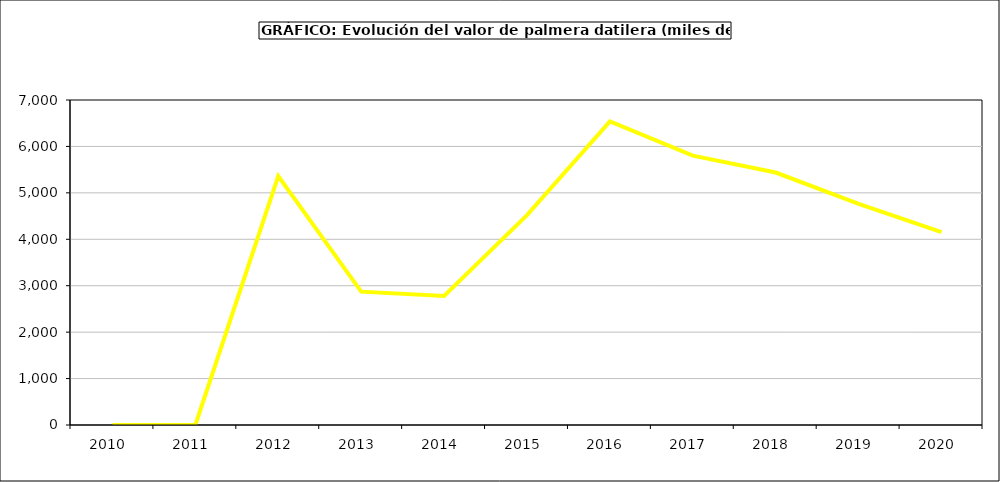
| Category | valor kiwi |
|---|---|
| 2010.0 | 0 |
| 2011.0 | 0 |
| 2012.0 | 5362.2 |
| 2013.0 | 2872 |
| 2014.0 | 2781 |
| 2015.0 | 4520 |
| 2016.0 | 6537 |
| 2017.0 | 5802.72 |
| 2018.0 | 5438.16 |
| 2019.0 | 4764.375 |
| 2020.0 | 4155.938 |